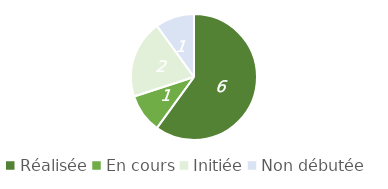
| Category | Series 0 |
|---|---|
| Réalisée | 6 |
| En cours | 1 |
| Initiée | 2 |
| Non débutée | 1 |